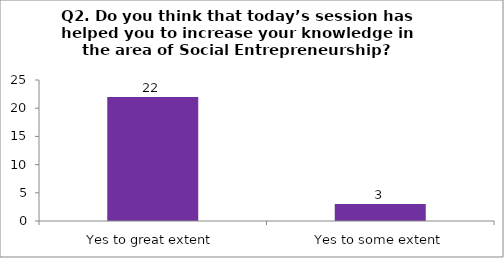
| Category | Q2. Do you think that today’s session have helped you to increase your knowledge in the area of Social Entrepreneurship? |
|---|---|
| Yes to great extent | 22 |
| Yes to some extent | 3 |